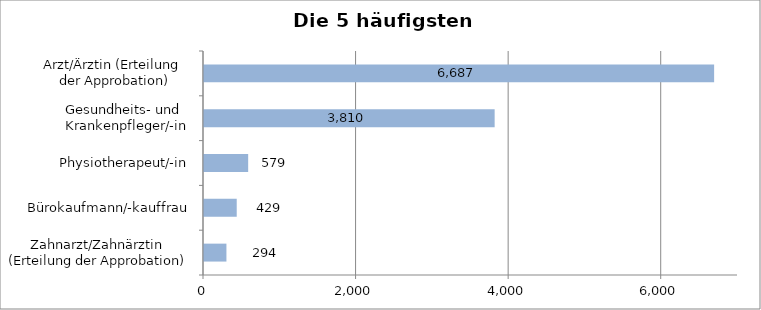
| Category | Series 0 |
|---|---|
| Zahnarzt/Zahnärztin
 (Erteilung der Approbation) | 294 |
| Bürokaufmann/-kauffrau | 429 |
| Physiotherapeut/-in | 579 |
| Gesundheits- und 
Krankenpfleger/-in | 3810 |
| Arzt/Ärztin (Erteilung 
der Approbation) | 6687 |